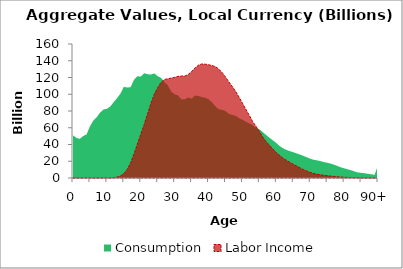
| Category | Consumption | Labor Income |
|---|---|---|
| 0 | 50959.152 | 0 |
|  | 47947.843 | 0 |
| 2 | 46718.716 | 0 |
| 3 | 50133.58 | 0 |
| 4 | 51988.46 | 0 |
| 5 | 61714.141 | 0 |
| 6 | 68590.52 | 0 |
| 7 | 72623.84 | 0 |
| 8 | 78060.165 | 0 |
| 9 | 81850.458 | 0 |
| 10 | 82578.66 | 0 |
| 11 | 85462.698 | 0 |
| 12 | 90552.217 | 486.051 |
| 13 | 95332.014 | 1117.354 |
| 14 | 100832.179 | 2429.988 |
| 15 | 108882.625 | 5218.052 |
| 16 | 108019.918 | 10386.336 |
| 17 | 108434.836 | 18062.949 |
| 18 | 117287.8 | 28641.263 |
| 19 | 121486.406 | 40594.602 |
| 20 | 121108.722 | 52177.285 |
| 21 | 125191.229 | 63821.174 |
| 22 | 123906.24 | 76473.827 |
| 23 | 123527.891 | 89076.813 |
| 24 | 124910.917 | 100117.674 |
| 25 | 121575.382 | 108012.36 |
| 26 | 119461.861 | 114192.843 |
| 27 | 114480.68 | 117664.614 |
| 28 | 110662.574 | 118471.134 |
| 29 | 102953.754 | 119325.452 |
| 30 | 99916.011 | 120194.186 |
| 31 | 98646.079 | 121435.379 |
| 32 | 93859.332 | 121738.234 |
| 33 | 94063.706 | 121714.749 |
| 34 | 96108.287 | 123607.87 |
| 35 | 94769.415 | 127143.636 |
| 36 | 98562.508 | 131305.951 |
| 37 | 97858.866 | 134729.391 |
| 38 | 96689.961 | 136166.16 |
| 39 | 95817.393 | 135916.72 |
| 40 | 94042.221 | 135261.395 |
| 41 | 90404.884 | 134270.986 |
| 42 | 85580.901 | 132992.445 |
| 43 | 82053.221 | 130146.706 |
| 44 | 81380.726 | 125873.519 |
| 45 | 79949.331 | 120524.249 |
| 46 | 76623.488 | 114693.771 |
| 47 | 75188.732 | 109272.515 |
| 48 | 74307.481 | 103329.13 |
| 49 | 71382.346 | 96550.861 |
| 50 | 69625.69 | 89317.299 |
| 51 | 67178.997 | 82004.852 |
| 52 | 65255.282 | 75003.078 |
| 53 | 62966.699 | 67467.584 |
| 54 | 60066.078 | 61706.555 |
| 55 | 58125.713 | 55589.845 |
| 56 | 54827.246 | 48901.005 |
| 57 | 51344.522 | 43285.601 |
| 58 | 47968.557 | 39058.339 |
| 59 | 44969.832 | 34531.182 |
| 60 | 41728.69 | 30404.875 |
| 61 | 38165.521 | 26856.03 |
| 62 | 35414.223 | 23595.096 |
| 63 | 33475.728 | 21059.38 |
| 64 | 32026.639 | 18627.897 |
| 65 | 30827.562 | 16353.248 |
| 66 | 29301.476 | 14310.301 |
| 67 | 27970.397 | 12126.757 |
| 68 | 26395.206 | 10059.095 |
| 69 | 24663.08 | 8293.417 |
| 70 | 23055.182 | 6723.478 |
| 71 | 21757.028 | 5451.664 |
| 72 | 21071.925 | 4538.454 |
| 73 | 20180.371 | 3830.406 |
| 74 | 19011.462 | 3240.761 |
| 75 | 18190.449 | 2739.043 |
| 76 | 17261.951 | 2314.058 |
| 77 | 15902.074 | 1894.278 |
| 78 | 14395.988 | 1530.012 |
| 79 | 12770.022 | 1185.821 |
| 80 | 11568.328 | 916.013 |
| 81 | 10405.375 | 731.881 |
| 82 | 9298.147 | 546.814 |
| 83 | 7948.172 | 370.061 |
| 84 | 6661.663 | 228.898 |
| 85 | 6170.888 | 137.369 |
| 86 | 5712.468 | 63.989 |
| 87 | 5078.269 | 45.982 |
| 88 | 4470.662 | 4.849 |
| 89 | 3737.839 | 0 |
| 90+ | 15235.456 | 0 |